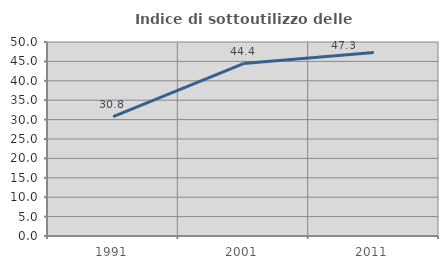
| Category | Indice di sottoutilizzo delle abitazioni  |
|---|---|
| 1991.0 | 30.795 |
| 2001.0 | 44.444 |
| 2011.0 | 47.309 |